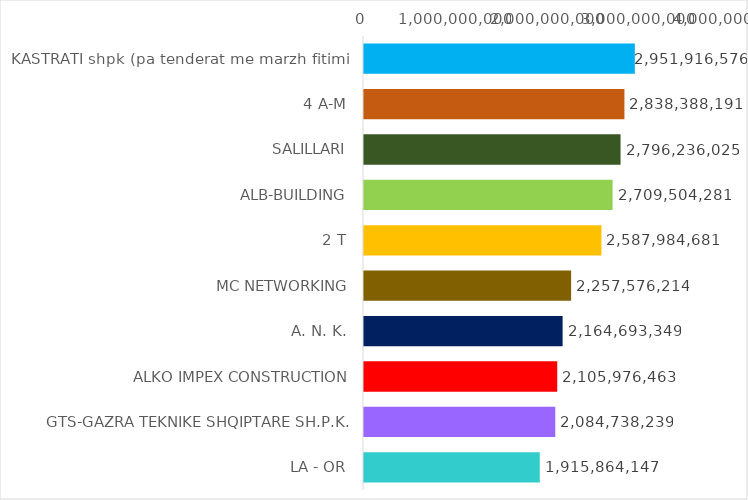
| Category | Oferta Fituese pa TVSH |
|---|---|
| KASTRATI shpk (pa tenderat me marzh fitimi) | 2951916576.16 |
| 4 A-M | 2838388190.68 |
| SALILLARI | 2796236024.68 |
| ALB-BUILDING | 2709504280.61 |
| 2 T | 2587984681.07 |
| MC NETWORKING | 2257576214.05 |
| A. N. K. | 2164693349.44 |
| ALKO IMPEX CONSTRUCTION | 2105976463.13 |
| GTS-GAZRA TEKNIKE SHQIPTARE SH.P.K. | 2084738239 |
| LA - OR | 1915864146.73 |